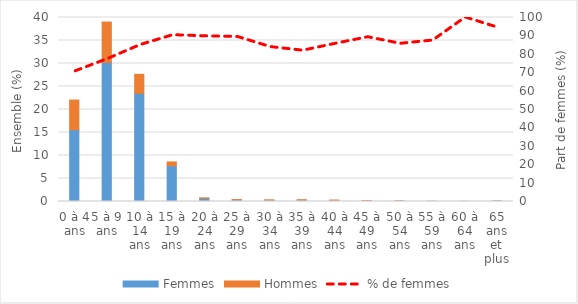
| Category | Femmes | Hommes |
|---|---|---|
| 0 à 4 ans | 15.607 | 6.447 |
| 5 à 9 ans | 30.237 | 8.775 |
| 10 à 14 ans | 23.515 | 4.131 |
| 15 à 19 ans | 7.773 | 0.825 |
| 20 à 24 ans | 0.697 | 0.079 |
| 25 à 29 ans | 0.361 | 0.043 |
| 30 à 34 ans | 0.287 | 0.055 |
| 35 à 39 ans | 0.306 | 0.067 |
| 40 à 44 ans | 0.257 | 0.043 |
| 45 à 49 ans | 0.153 | 0.018 |
| 50 à 54 ans | 0.11 | 0.018 |
| 55 à 59 ans | 0.043 | 0.006 |
| 60 à 64 ans | 0.037 | 0 |
| 65 ans et plus | 0.104 | 0.006 |